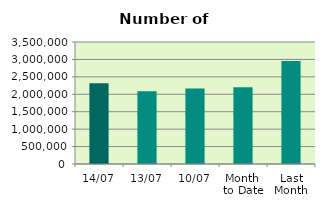
| Category | Series 0 |
|---|---|
| 14/07 | 2313144 |
| 13/07 | 2090568 |
| 10/07 | 2163068 |
| Month 
to Date | 2203713 |
| Last
Month | 2956123.091 |